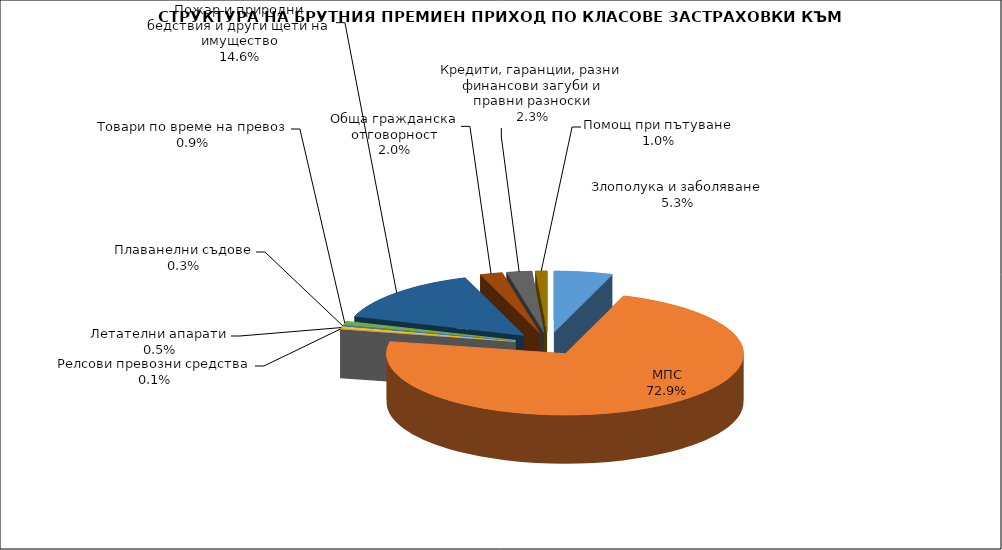
| Category | Злополука и заболяване |
|---|---|
| Злополука и заболяване | 0.053 |
| МПС | 0.729 |
| Релсови превозни средства | 0.001 |
| Летателни апарати | 0.005 |
| Плаванелни съдове | 0.003 |
| Товари по време на превоз | 0.009 |
| Пожар и природни бедствия и други щети на имущество | 0.146 |
| Обща гражданска отговорност | 0.02 |
| Кредити, гаранции, разни финансови загуби и правни разноски | 0.023 |
| Помощ при пътуване | 0.01 |